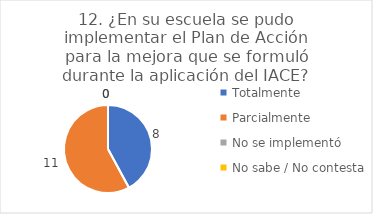
| Category | 12. ¿En su escuela se pudo implementar el Plan de Acción para la mejora que se formuló durante la aplicación del IACE? |
|---|---|
| Totalmente  | 0.421 |
| Parcialmente  | 0.579 |
| No se implementó  | 0 |
| No sabe / No contesta | 0 |